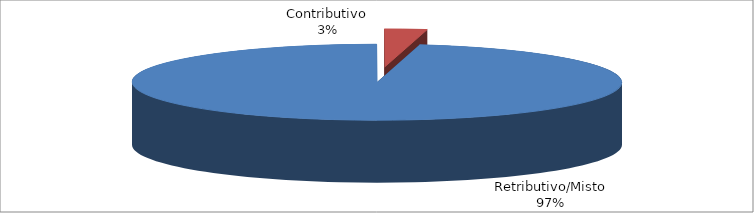
| Category | Series 1 |
|---|---|
| Retributivo/Misto | 70017 |
| Contributivo | 2020 |